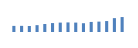
| Category | Exportações (1) |
|---|---|
| 0 | 203692.629 |
| 1 | 204985.899 |
| 2 | 199789.293 |
| 3 | 228223.553 |
| 4 | 265930.688 |
| 5 | 297441.741 |
| 6 | 313195.508 |
| 7 | 319331.634 |
| 8 | 313646.514 |
| 9 | 292708.824 |
| 10 | 335676.548 |
| 11 | 346139.442 |
| 12 | 364472.386 |
| 13 | 462235.534 |
| 14 | 497997.465 |